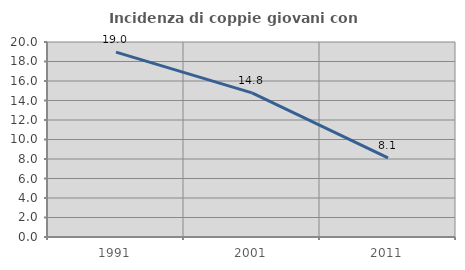
| Category | Incidenza di coppie giovani con figli |
|---|---|
| 1991.0 | 18.966 |
| 2001.0 | 14.783 |
| 2011.0 | 8.108 |